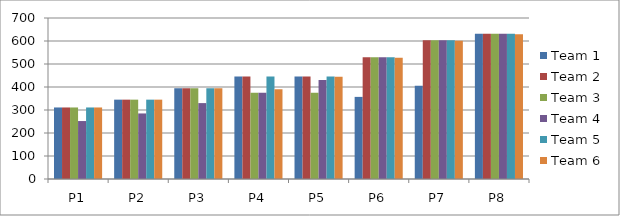
| Category | Team 1 | Team 2 | Team 3 | Team 4 | Team 5 | Team 6 |
|---|---|---|---|---|---|---|
| P1 | 311 | 311 | 311 | 252 | 311 | 311 |
| P2 | 345 | 345 | 345 | 285 | 345 | 345 |
| P3 | 395 | 395 | 395 | 330 | 395 | 395 |
| P4 | 446 | 446 | 375 | 375 | 446 | 390 |
| P5 | 446 | 446 | 375 | 430 | 446 | 445 |
| P6 | 357 | 529 | 529 | 529 | 529 | 527 |
| P7 | 405 | 603 | 603 | 603 | 603 | 601 |
| P8 | 631 | 631 | 631 | 631 | 631 | 629 |